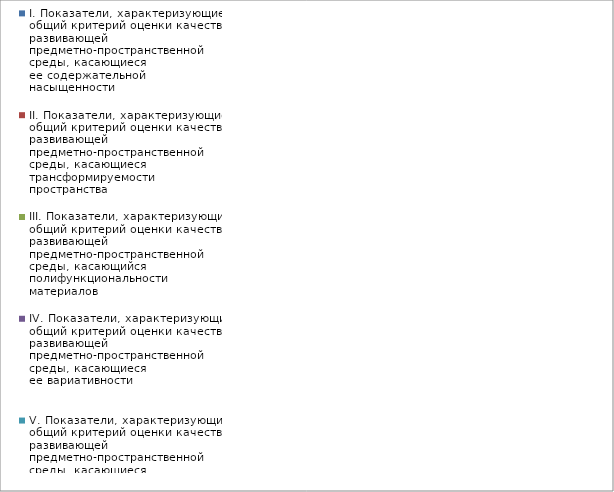
| Category | I. Показатели, характеризующие общий критерий оценки качества развивающей предметно-пространственной среды, касающиеся ее содержательной насыщенности | II. Показатели, характеризующие общий критерий оценки качества развивающей предметно-пространственной среды, касающиеся трансформируемости пространства | III. Показатели, характеризующие общий критерий оценки качества развивающей предметно-пространственной среды, касающийся полифункциональности материалов | IV. Показатели, характеризующие общий критерий оценки качества развивающей предметно-пространственной среды, касающиеся ее вариативности | V. Показатели, характеризующие общий критерий оценки качества развивающей предметно-пространственной среды, касающиеся ее доступности | VI. Показатели, характеризующие общий критерий оценки качества развивающей предметно-пространственной среды, касающиеся безопасности предметно-пространственной среды |
|---|---|---|---|---|---|---|
| Утята | 0.818 | 0.833 | 0.778 | 0.833 | 1 | 0.9 |